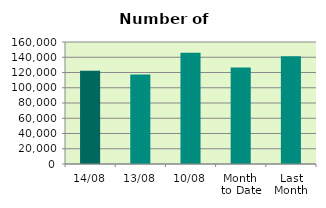
| Category | Series 0 |
|---|---|
| 14/08 | 122164 |
| 13/08 | 117376 |
| 10/08 | 145994 |
| Month 
to Date | 126394.4 |
| Last
Month | 141432.273 |